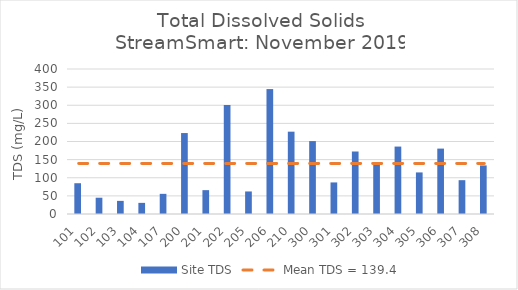
| Category | Site TDS |
|---|---|
| 101.0 | 84.9 |
| 102.0 | 44.9 |
| 103.0 | 36.2 |
| 104.0 | 30.7 |
| 107.0 | 55.6 |
| 200.0 | 223.3 |
| 201.0 | 65.8 |
| 202.0 | 300.7 |
| 205.0 | 62.2 |
| 206.0 | 344.6 |
| 210.0 | 227.1 |
| 300.0 | 201.1 |
| 301.0 | 87.1 |
| 302.0 | 172.4 |
| 303.0 | 142.9 |
| 304.0 | 186 |
| 305.0 | 114.7 |
| 306.0 | 180.4 |
| 307.0 | 93.3 |
| 308.0 | 134 |